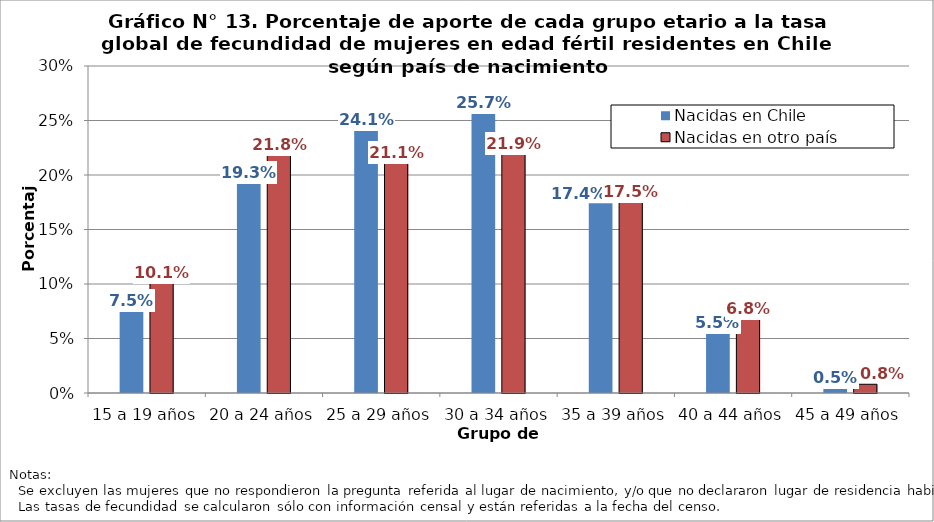
| Category | Nacidas en Chile | Nacidas en otro país |
|---|---|---|
| 15 a 19 años | 0.075 | 0.101 |
| 20 a 24 años | 0.193 | 0.218 |
| 25 a 29 años | 0.241 | 0.211 |
| 30 a 34 años | 0.257 | 0.219 |
| 35 a 39 años | 0.174 | 0.175 |
| 40 a 44 años | 0.055 | 0.068 |
| 45 a 49 años | 0.005 | 0.008 |